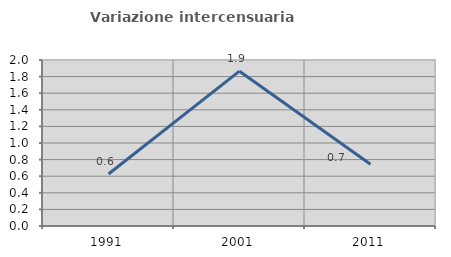
| Category | Variazione intercensuaria annua |
|---|---|
| 1991.0 | 0.627 |
| 2001.0 | 1.866 |
| 2011.0 | 0.744 |